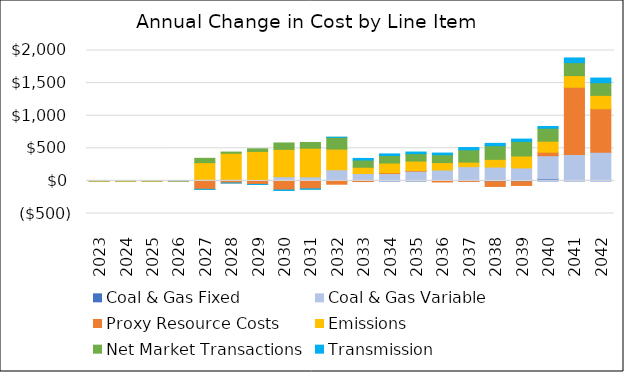
| Category | Coal & Gas Fixed | Coal & Gas Variable | Proxy Resource Costs | Emissions | Net Market Transactions | Transmission |
|---|---|---|---|---|---|---|
| 2023.0 | 0 | -0.435 | -0.001 | 0.001 | 0.477 | 0 |
| 2024.0 | 0 | 0.133 | -0.242 | -0.042 | 0.111 | 0 |
| 2025.0 | 0 | 0.331 | -0.999 | 0.157 | 1.984 | 0 |
| 2026.0 | 0 | 0.569 | -0.982 | 0.335 | 2.766 | 0.316 |
| 2027.0 | 0 | 24.131 | -128.785 | 255.845 | 66.244 | -0.538 |
| 2028.0 | 0 | 24.503 | -31.66 | 399.315 | 18.168 | -0.549 |
| 2029.0 | -1.423 | 18.98 | -52.269 | 433.047 | 39.837 | -0.698 |
| 2030.0 | -1.455 | 64.763 | -138.335 | 419.027 | 98.055 | -6.625 |
| 2031.0 | -1.488 | 61.676 | -120.661 | 439.698 | 88.102 | -6.323 |
| 2032.0 | -1.522 | 170.98 | -49.417 | 317.165 | 180.608 | 1.146 |
| 2033.0 | -1.557 | 113.313 | -8.149 | 95.89 | 111.08 | 24.335 |
| 2034.0 | -1.592 | 112.769 | 12.845 | 148.366 | 115.551 | 24.321 |
| 2035.0 | -1.629 | 148.878 | 9.247 | 145.642 | 114.303 | 25.035 |
| 2036.0 | -1.666 | 167.51 | -14.728 | 112.866 | 120.946 | 25.696 |
| 2037.0 | -1.704 | 218.925 | -5.049 | 69.036 | 188.41 | 35.099 |
| 2038.0 | -13.289 | 212.477 | -71.729 | 117.951 | 209.772 | 35.422 |
| 2039.0 | -13.592 | 199.494 | -56.162 | 182.529 | 223.363 | 35.753 |
| 2040.0 | 31.821 | 354.445 | 54.074 | 168.701 | 198.924 | 26.925 |
| 2041.0 | 12.331 | 392.507 | 1031.462 | 178.759 | 199.172 | 71.661 |
| 2042.0 | 12.613 | 426.011 | 668.3 | 205.185 | 194.657 | 70.508 |